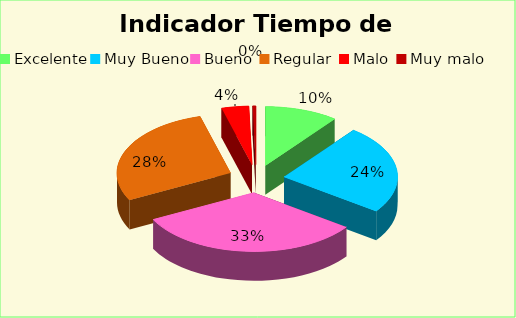
| Category | Series 0 |
|---|---|
| Excelente | 0.104 |
| Muy Bueno | 0.245 |
| Bueno  | 0.325 |
| Regular  | 0.283 |
| Malo  | 0.039 |
| Muy malo  | 0.005 |